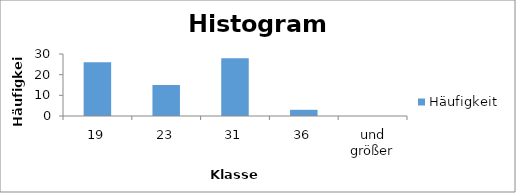
| Category | Häufigkeit |
|---|---|
| 19 | 26 |
| 23 | 15 |
| 31 | 28 |
| 36 | 3 |
| und größer | 0 |